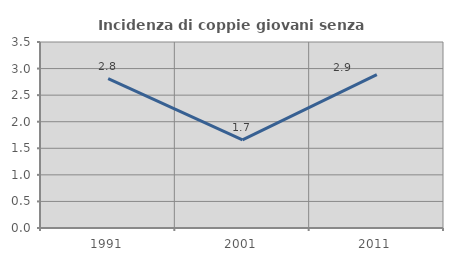
| Category | Incidenza di coppie giovani senza figli |
|---|---|
| 1991.0 | 2.811 |
| 2001.0 | 1.66 |
| 2011.0 | 2.885 |